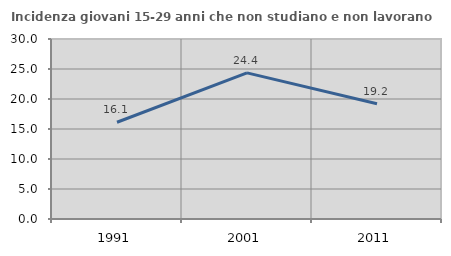
| Category | Incidenza giovani 15-29 anni che non studiano e non lavorano  |
|---|---|
| 1991.0 | 16.129 |
| 2001.0 | 24.357 |
| 2011.0 | 19.213 |